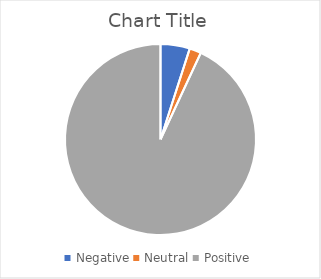
| Category | Series 0 |
|---|---|
| Negative | 0.05 |
| Neutral | 0.02 |
| Positive | 0.94 |